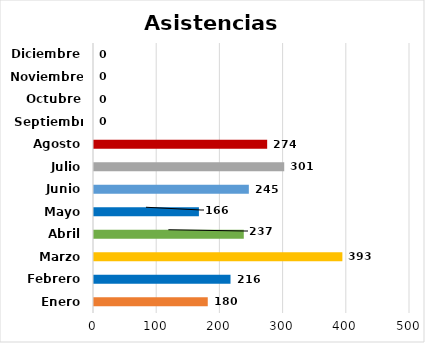
| Category | Asistencias Técnicas  |
|---|---|
| Enero | 180 |
| Febrero | 216 |
| Marzo | 393 |
| Abril | 237 |
| Mayo | 166 |
| Junio | 245 |
| Julio | 301 |
| Agosto | 274 |
| Septiembre | 0 |
| Octubre | 0 |
| Noviembre | 0 |
| Diciembre | 0 |